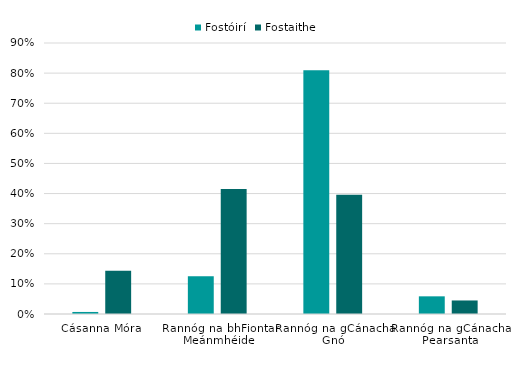
| Category | Fostóirí | Fostaithe |
|---|---|---|
| Cásanna Móra | 0.007 | 0.144 |
| Rannóg na bhFiontar Meánmhéide | 0.125 | 0.415 |
| Rannóg na gCánacha Gnó | 0.809 | 0.396 |
| Rannóg na gCánacha Pearsanta | 0.059 | 0.045 |